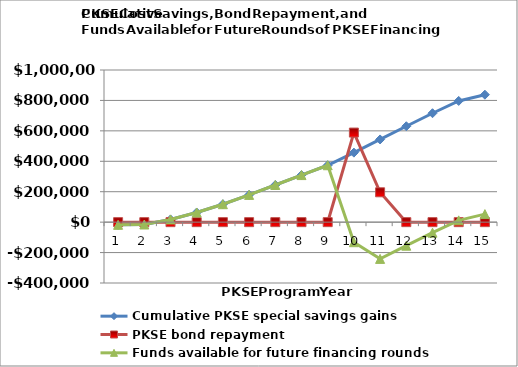
| Category | Cumulative PKSE special savings gains | PKSE bond repayment | Funds available for future financing rounds |
|---|---|---|---|
| 1.0 | -17662.5 | 0 | -17662.5 |
| 2.0 | -15549.43 | 0 | -15549.43 |
| 3.0 | 17844.188 | 0 | 17844.188 |
| 4.0 | 63420.094 | 0 | 63420.094 |
| 5.0 | 117830.457 | 0 | 117830.457 |
| 6.0 | 179185.904 | 0 | 179185.904 |
| 7.0 | 244163.143 | 0 | 244163.143 |
| 8.0 | 309244.547 | 0 | 309244.547 |
| 9.0 | 373964.297 | 0 | 373964.297 |
| 10.0 | 456896.073 | 588750 | -131853.927 |
| 11.0 | 543545.629 | 196250 | -241454.371 |
| 12.0 | 630206.148 | 0 | -154793.852 |
| 13.0 | 715864.863 | 0 | -69135.137 |
| 14.0 | 796713.084 | 0 | 11713.084 |
| 15.0 | 837711.986 | 0 | 52711.986 |